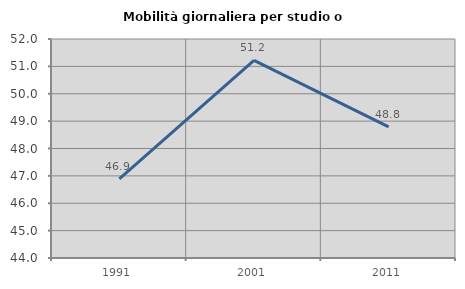
| Category | Mobilità giornaliera per studio o lavoro |
|---|---|
| 1991.0 | 46.889 |
| 2001.0 | 51.221 |
| 2011.0 | 48.787 |